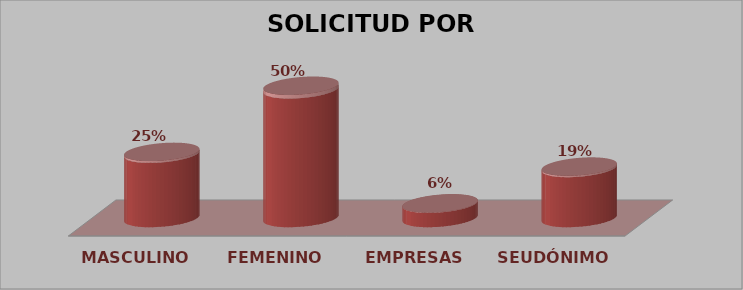
| Category | SOLICITUD POR GÉNERO | Series 1 |
|---|---|---|
| MASCULINO | 9 | 0.25 |
| FEMENINO | 18 | 0.5 |
| EMPRESAS | 2 | 0.056 |
| SEUDÓNIMO | 7 | 0.194 |